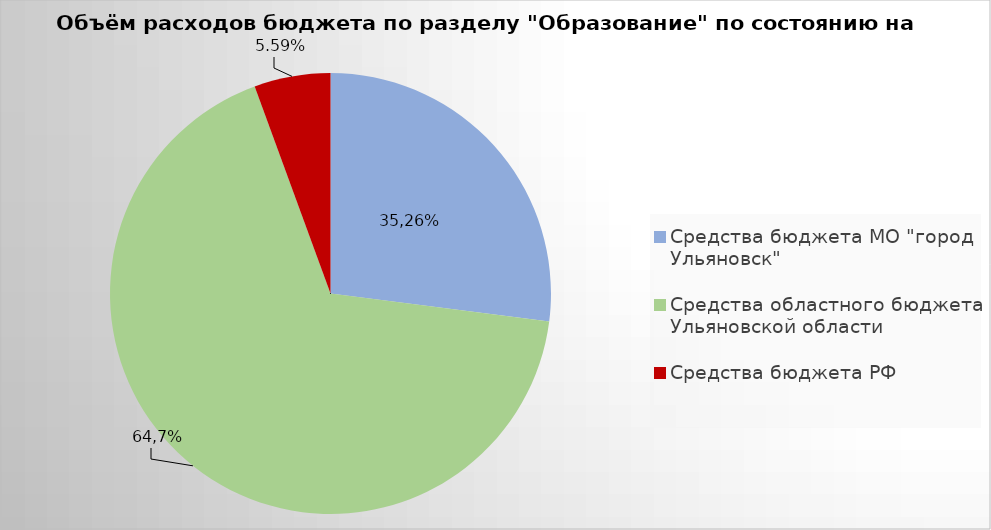
| Category | Series 0 |
|---|---|
| Средства бюджета МО "город Ульяновск" | 2026373.9 |
| Средства областного бюджета Ульяновской области | 5051291.3 |
| Средства бюджета РФ | 418759.2 |